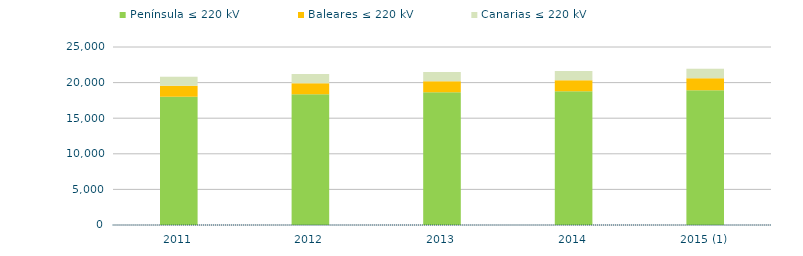
| Category | Península ≤ 220 kV | Baleares ≤ 220 kV | Canarias ≤ 220 kV |
|---|---|---|---|
| 2011 | 18000.768 | 1540.516 | 1289.05 |
| 2012 | 18369.641 | 1543.521 | 1289.05 |
| 2013 | 18642.941 | 1543.521 | 1289.05 |
| 2014 | 18782.059 | 1544.972 | 1289.135 |
| 2015 (1) | 18924.164 | 1673.682 | 1346.959 |